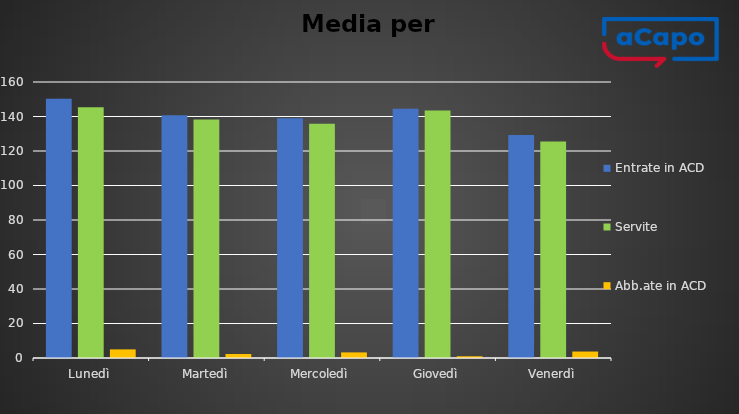
| Category | Entrate in ACD | Servite | Abb.ate in ACD |
|---|---|---|---|
| Lunedì | 150.333 | 145.333 | 5 |
| Martedì | 140.667 | 138.333 | 2.333 |
| Mercoledì | 139 | 135.75 | 3.25 |
| Giovedì | 144.5 | 143.5 | 1 |
| Venerdì | 129.25 | 125.5 | 3.75 |